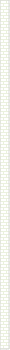
| Category | 19-24 Tahun | 25-44 Tahun | 45+ Tahun |
|---|---|---|---|
| 2019.0 | 9 | 50 | 6 |
| 2020.0 | 8 | 19 | 4 |
| 2021.0 | 12 | 22 | 3 |